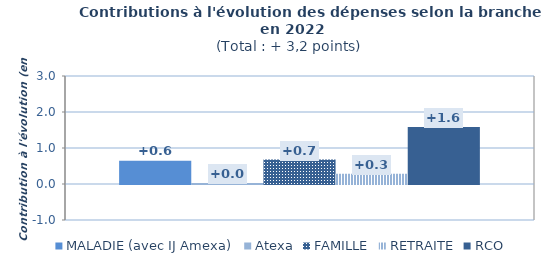
| Category | MALADIE (avec IJ Amexa) | Atexa | FAMILLE | RETRAITE | RCO |
|---|---|---|---|---|---|
| Contri croiss | 0.649 | 0.028 | 0.679 | 0.288 | 1.583 |